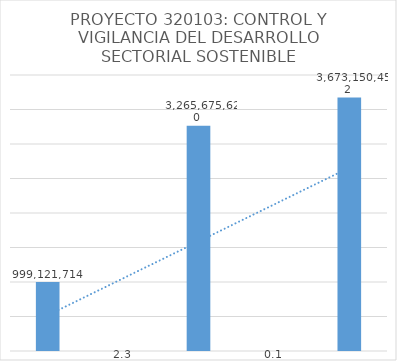
| Category | Series 0 |
|---|---|
| 0 | 999121714 |
| 1 | 2.269 |
| 2 | 3265675620.154 |
| 3 | 0.125 |
| 4 | 3673150452.125 |